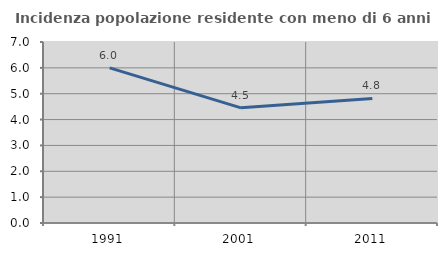
| Category | Incidenza popolazione residente con meno di 6 anni |
|---|---|
| 1991.0 | 5.998 |
| 2001.0 | 4.453 |
| 2011.0 | 4.815 |